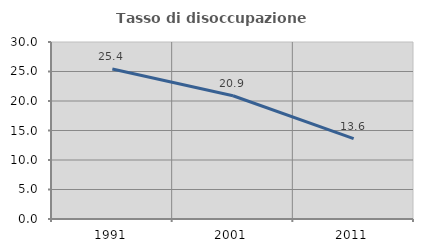
| Category | Tasso di disoccupazione giovanile  |
|---|---|
| 1991.0 | 25.424 |
| 2001.0 | 20.896 |
| 2011.0 | 13.636 |